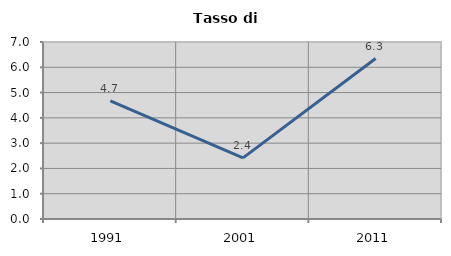
| Category | Tasso di disoccupazione   |
|---|---|
| 1991.0 | 4.668 |
| 2001.0 | 2.415 |
| 2011.0 | 6.346 |